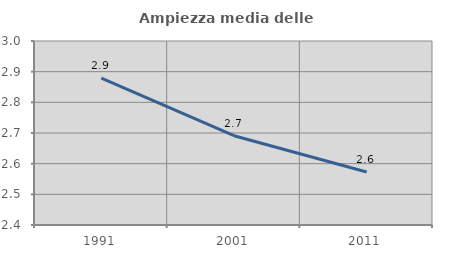
| Category | Ampiezza media delle famiglie |
|---|---|
| 1991.0 | 2.879 |
| 2001.0 | 2.691 |
| 2011.0 | 2.573 |